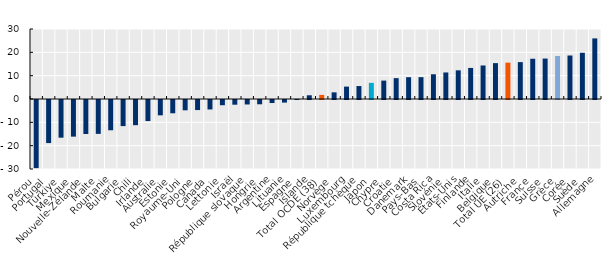
| Category | Series 0 |
|---|---|
| Pérou | -29.212 |
| Portugal | -18.46 |
| Türkiye | -16.15 |
| Mexique | -15.7 |
| Nouvelle-Zélande | -14.585 |
| Malte | -14.521 |
| Roumanie | -12.972 |
| Bulgarie | -11.186 |
| Chili | -10.8 |
| Irlande | -9.034 |
| Australie | -6.571 |
| Estonie | -5.688 |
| Royaume-Uni | -4.416 |
| Pologne | -4.311 |
| Canada | -4.06 |
| Lettonie | -2.242 |
| Israël | -2.018 |
| République slovaque | -1.915 |
| Hongrie | -1.839 |
| Argentine | -1.3 |
| Lituanie | -1.117 |
| Espagne | 0.038 |
| Islande | 1.595 |
| Total OCDE (38) | 1.752 |
| Norvège | 2.854 |
| Luxembourg | 5.312 |
| République tchèque | 5.547 |
| Japon | 6.921 |
| Chypre | 7.886 |
| Croatie | 8.946 |
| Danemark | 9.345 |
| Pays-Bas | 9.362 |
| Costa Rica | 10.6 |
| Slovénie | 11.374 |
| États-Unis | 12.285 |
| Finlande | 13.314 |
| Italie | 14.367 |
| Belgique | 15.375 |
| Total UE (26) | 15.581 |
| Autriche | 15.805 |
| France | 17.246 |
| Suisse | 17.334 |
| Grèce | 18.421 |
| Corée | 18.647 |
| Suède | 19.815 |
| Allemagne | 25.971 |